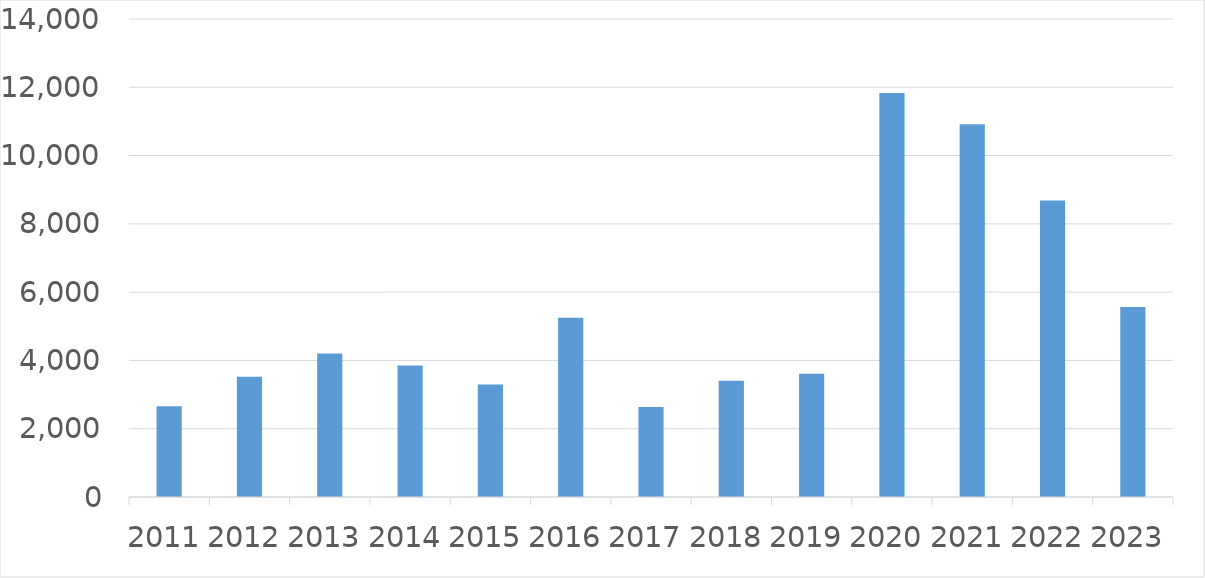
| Category | Series 0 |
|---|---|
| 2011 | 2656 |
| 2012 | 3524 |
| 2013 | 4200 |
| 2014 | 3849 |
| 2015 | 3294 |
| 2016 | 5249 |
| 2017 | 2636 |
| 2018 | 3406 |
| 2019 | 3611 |
| 2020 | 11835 |
| 2021 | 10919 |
| 2022 | 8682 |
| 2023 | 5562 |